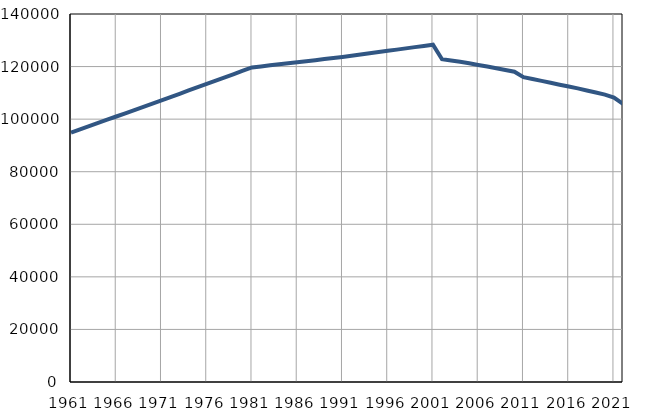
| Category | Број
становника |
|---|---|
| 1961.0 | 94866 |
| 1962.0 | 96094 |
| 1963.0 | 97321 |
| 1964.0 | 98549 |
| 1965.0 | 99777 |
| 1966.0 | 101005 |
| 1967.0 | 102232 |
| 1968.0 | 103460 |
| 1969.0 | 104688 |
| 1970.0 | 105915 |
| 1971.0 | 107143 |
| 1972.0 | 108396 |
| 1973.0 | 109648 |
| 1974.0 | 110901 |
| 1975.0 | 112153 |
| 1976.0 | 113405 |
| 1977.0 | 114659 |
| 1978.0 | 115911 |
| 1979.0 | 117164 |
| 1980.0 | 118416 |
| 1981.0 | 119669 |
| 1982.0 | 120065 |
| 1983.0 | 120462 |
| 1984.0 | 120858 |
| 1985.0 | 121255 |
| 1986.0 | 121650 |
| 1987.0 | 122047 |
| 1988.0 | 122444 |
| 1989.0 | 122840 |
| 1990.0 | 123237 |
| 1991.0 | 123633 |
| 1992.0 | 124103 |
| 1993.0 | 124573 |
| 1994.0 | 125042 |
| 1995.0 | 125512 |
| 1996.0 | 125982 |
| 1997.0 | 126452 |
| 1998.0 | 126922 |
| 1999.0 | 127392 |
| 2000.0 | 127861 |
| 2001.0 | 128331 |
| 2002.0 | 122792 |
| 2003.0 | 122313 |
| 2004.0 | 121869 |
| 2005.0 | 121287 |
| 2006.0 | 120626 |
| 2007.0 | 120000 |
| 2008.0 | 119386 |
| 2009.0 | 118720 |
| 2010.0 | 118040 |
| 2011.0 | 115972 |
| 2012.0 | 115287 |
| 2013.0 | 114548 |
| 2014.0 | 113827 |
| 2015.0 | 113113 |
| 2016.0 | 112414 |
| 2017.0 | 111709 |
| 2018.0 | 110918 |
| 2019.0 | 110148 |
| 2020.0 | 109340 |
| 2021.0 | 108187 |
| 2022.0 | 105768 |